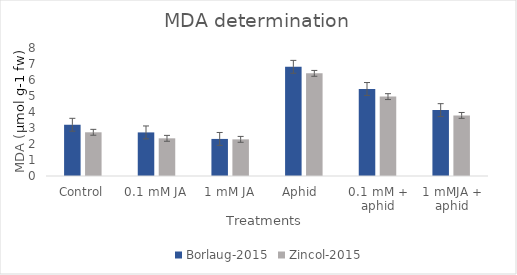
| Category | Borlaug-2015 | Zincol-2015 |
|---|---|---|
| Control | 3.202 | 2.732 |
| 0.1 mM JA | 2.725 | 2.355 |
| 1 mM JA | 2.317 | 2.29 |
| Aphid  | 6.824 | 6.415 |
| 0.1 mM + aphid | 5.439 | 4.961 |
| 1 mMJA + aphid | 4.118 | 3.787 |